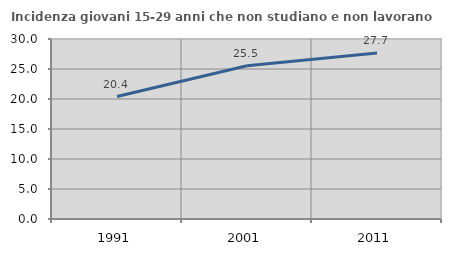
| Category | Incidenza giovani 15-29 anni che non studiano e non lavorano  |
|---|---|
| 1991.0 | 20.408 |
| 2001.0 | 25.532 |
| 2011.0 | 27.66 |